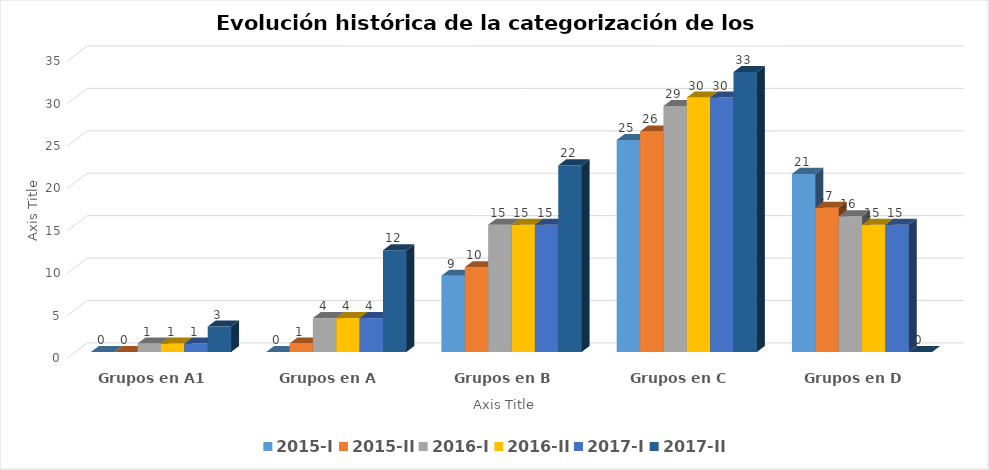
| Category | 2015-I | 2015-II | 2016-I | 2016-II | 2017-I | 2017-II |
|---|---|---|---|---|---|---|
| Grupos en A1 | 0 | 0 | 1 | 1 | 1 | 3 |
| Grupos en A | 0 | 1 | 4 | 4 | 4 | 12 |
| Grupos en B | 9 | 10 | 15 | 15 | 15 | 22 |
| Grupos en C | 25 | 26 | 29 | 30 | 30 | 33 |
| Grupos en D | 21 | 17 | 16 | 15 | 15 | 0 |